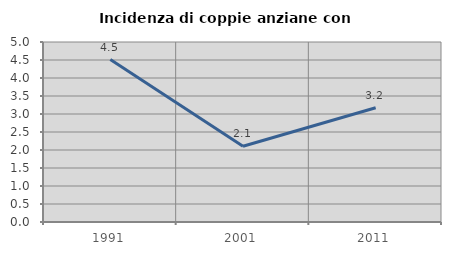
| Category | Incidenza di coppie anziane con figli |
|---|---|
| 1991.0 | 4.511 |
| 2001.0 | 2.105 |
| 2011.0 | 3.175 |